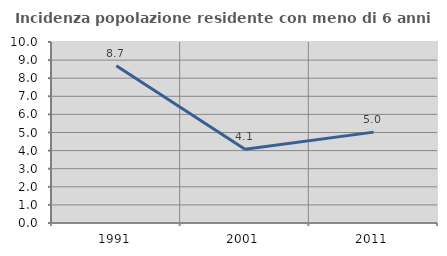
| Category | Incidenza popolazione residente con meno di 6 anni |
|---|---|
| 1991.0 | 8.689 |
| 2001.0 | 4.076 |
| 2011.0 | 5.02 |